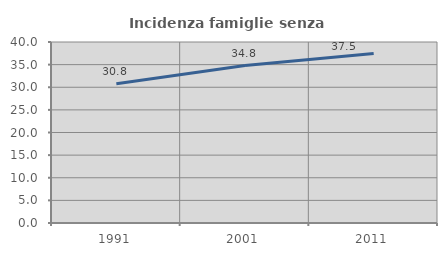
| Category | Incidenza famiglie senza nuclei |
|---|---|
| 1991.0 | 30.796 |
| 2001.0 | 34.787 |
| 2011.0 | 37.452 |